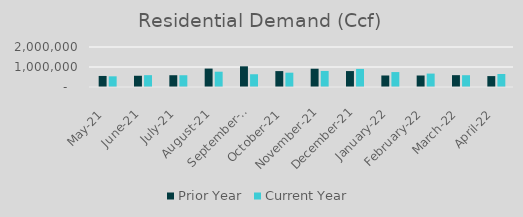
| Category | Prior Year | Current Year |
|---|---|---|
| 2021-05-01 | 552550.404 | 533967.423 |
| 2021-06-01 | 561680.927 | 591911.753 |
| 2021-07-01 | 588815.728 | 587861.265 |
| 2021-08-01 | 920418.723 | 764849.567 |
| 2021-09-01 | 1034271.241 | 637451.79 |
| 2021-10-01 | 795392.365 | 715703.433 |
| 2021-11-01 | 913450.318 | 802383.882 |
| 2021-12-01 | 796803.85 | 904247.352 |
| 2022-01-01 | 575698.992 | 746791.488 |
| 2022-02-01 | 574964.407 | 670556.394 |
| 2022-03-01 | 591912.627 | 589693.822 |
| 2022-04-01 | 545392.69 | 650741.307 |